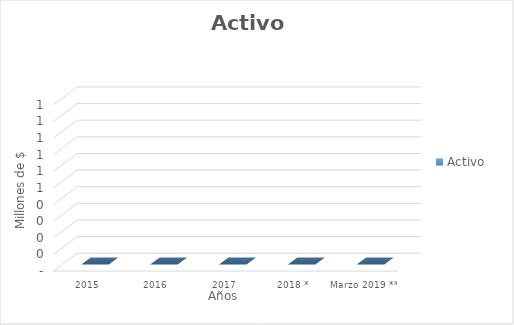
| Category | Activo |
|---|---|
| 2015 | 0 |
| 2016 | 0 |
| 2017 | 0 |
| 2018 * | 0 |
| Marzo 2019 ** | 0 |